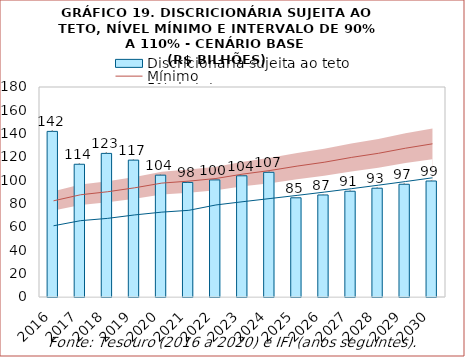
| Category | Discricionária sujeita ao teto |
|---|---|
| 2016.0 | 141952.542 |
| 2017.0 | 113785.272 |
| 2018.0 | 123084.243 |
| 2019.0 | 117325.09 |
| 2020.0 | 104448.563 |
| 2021.0 | 98196.499 |
| 2022.0 | 100359.912 |
| 2023.0 | 103897.087 |
| 2024.0 | 106871.893 |
| 2025.0 | 85031.305 |
| 2026.0 | 87457.137 |
| 2027.0 | 90650.743 |
| 2028.0 | 93247.353 |
| 2029.0 | 96641.416 |
| 2030.0 | 99420.544 |